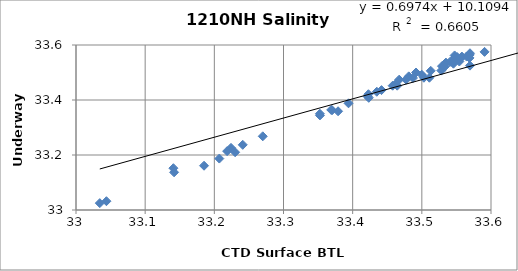
| Category | Series 0 |
|---|---|
| 33.5647 | 33.558 |
| 33.5405 | 33.538 |
| 33.4811 | 33.486 |
| 33.7019 | 33.7 |
| 33.6997 | 33.695 |
| 33.6937 | 33.687 |
| 33.6485 | 33.643 |
| 33.5474 | 33.562 |
| 33.6112 | 33.602 |
| 33.6795 | 33.683 |
| 33.7061 | 33.716 |
| 33.5331 | 33.521 |
| 33.2241 | 33.226 |
| 33.394 | 33.388 |
| 33.3789 | 33.359 |
| 33.4417 | 33.436 |
| 33.4772 | 33.474 |
| 33.369 | 33.364 |
| 33.3703 | 33.363 |
| 33.2072 | 33.187 |
| 33.5474 | 33.553 |
| 33.4228 | 33.421 |
| 33.5548 | 33.549 |
| 33.5484 | 33.545 |
| 33.5457 | 33.532 |
| 33.5692 | 33.564 |
| 33.4999 | 33.492 |
| 33.5129 | 33.506 |
| 33.503 | 33.481 |
| 33.4673 | 33.474 |
| 33.5109 | 33.481 |
| 33.5907 | 33.575 |
| 33.5282 | 33.507 |
| 33.6375 | 33.63 |
| 33.6077 | 33.598 |
| 33.5476 | 33.543 |
| 33.5542 | 33.54 |
| 33.6032 | 33.596 |
| 33.4216 | 33.413 |
| 33.1408 | 33.152 |
| 33.2301 | 33.21 |
| 33.2185 | 33.214 |
| 34.262 | 33.378 |
| 33.2411 | 33.237 |
| 33.044 | 33.032 |
| 33.1851 | 33.161 |
| 33.1418 | 33.137 |
| 33.5457 | 33.539 |
| 33.5512 | 33.556 |
| 33.5579 | 33.558 |
| 33.5348 | 33.536 |
| 33.4916 | 33.5 |
| 33.5696 | 33.525 |
| 33.5689 | 33.553 |
| 33.5562 | 33.552 |
| 33.5696 | 33.57 |
| 33.4578 | 33.452 |
| 33.4349 | 33.43 |
| 33.0344 | 33.025 |
| 33.3526 | 33.35 |
| 33.27 | 33.268 |
| 33.4233 | 33.408 |
| 33.3527 | 33.344 |
| 33.4872 | 33.48 |
| 33.4622 | 33.458 |
| 33.4644 | 33.452 |
| 33.5291 | 33.523 |